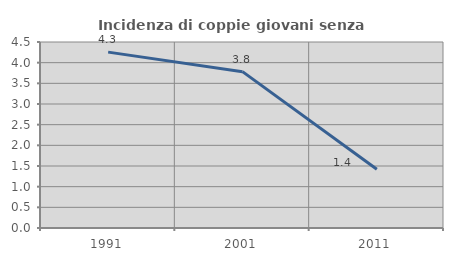
| Category | Incidenza di coppie giovani senza figli |
|---|---|
| 1991.0 | 4.255 |
| 2001.0 | 3.783 |
| 2011.0 | 1.42 |